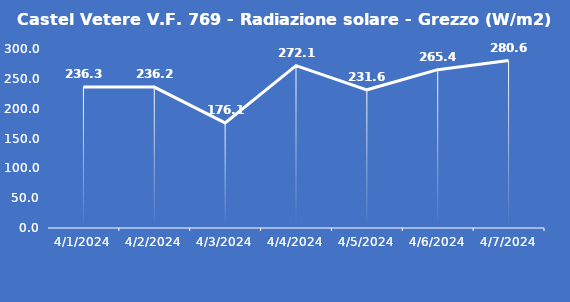
| Category | Castel Vetere V.F. 769 - Radiazione solare - Grezzo (W/m2) |
|---|---|
| 4/1/24 | 236.3 |
| 4/2/24 | 236.2 |
| 4/3/24 | 176.1 |
| 4/4/24 | 272.1 |
| 4/5/24 | 231.6 |
| 4/6/24 | 265.4 |
| 4/7/24 | 280.6 |